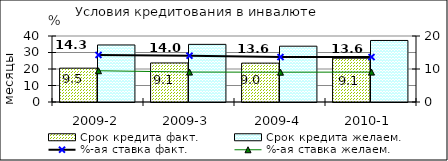
| Category | Срок кредита факт.  | Срок кредита желаем. |
|---|---|---|
| 2009-2 | 20.51 | 34.57 |
| 2009-3 | 23.67 | 34.93 |
| 2009-4 | 23.57 | 33.82 |
| 2010-1 | 26.54 | 37.3 |